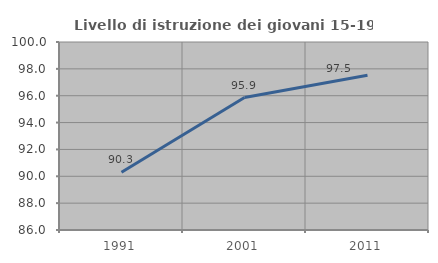
| Category | Livello di istruzione dei giovani 15-19 anni |
|---|---|
| 1991.0 | 90.306 |
| 2001.0 | 95.862 |
| 2011.0 | 97.521 |